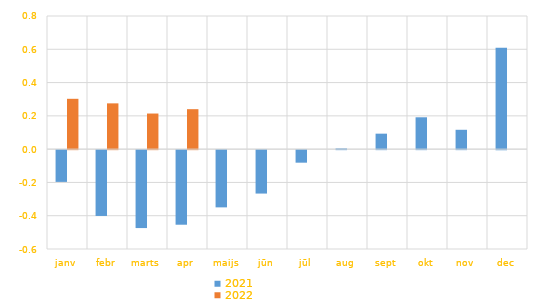
| Category | 2021 | 2022 |
|---|---|---|
| janv | -0.191 | 0.302 |
| febr | -0.395 | 0.275 |
| marts | -0.468 | 0.214 |
| apr | -0.448 | 0.24 |
| maijs | -0.344 | 0 |
| jūn | -0.261 | 0 |
| jūl | -0.075 | 0 |
| aug | 0.004 | 0 |
| sept | 0.093 | 0 |
| okt | 0.191 | 0 |
| nov | 0.116 | 0 |
| dec | 0.609 | 0 |